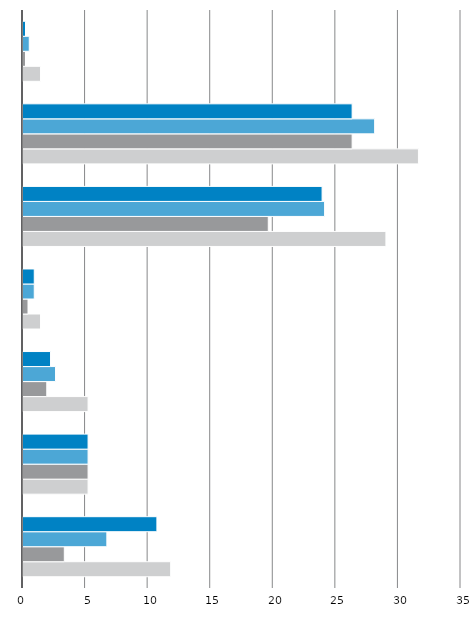
| Category | Summe von Maximum | Summe von Minimum | Summe von Deutschland | Summe von Anteil an den Beschäftigten insg. In % wB |
|---|---|---|---|---|
| 7 | 11.8 | 3.3 | 6.7 | 10.7 |
| 6 | 5.2 | 5.2 | 5.2 | 5.2 |
| 5 | 5.2 | 1.9 | 2.6 | 2.2 |
| 4 | 1.4 | 0.4 | 0.9 | 0.9 |
| 3 | 29 | 19.6 | 24.1 | 23.9 |
| 2 | 31.6 | 26.3 | 28.1 | 26.3 |
| 1 | 1.4 | 0.2 | 0.5 | 0.2 |